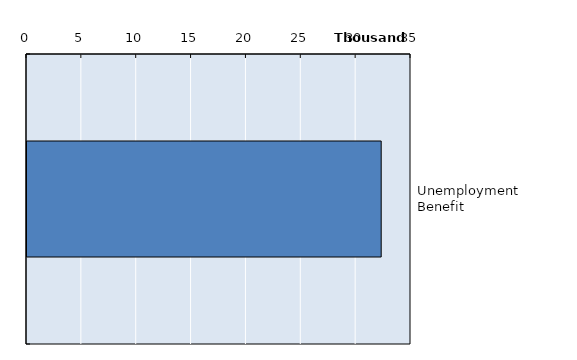
| Category | Series 0 |
|---|---|
| Unemployment Benefit | 32283 |